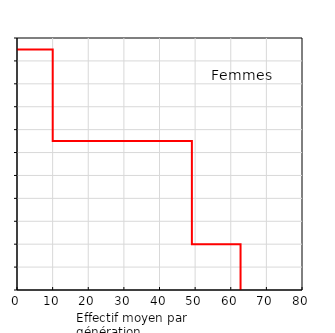
| Category | Femmes |
|---|---|
| 62.75 | 0 |
| 62.75 | 20 |
| 49.08888888888889 | 20 |
| 49.08888888888889 | 65 |
| 10.025 | 65 |
| 10.025 | 105 |
| 0.0 | 105 |